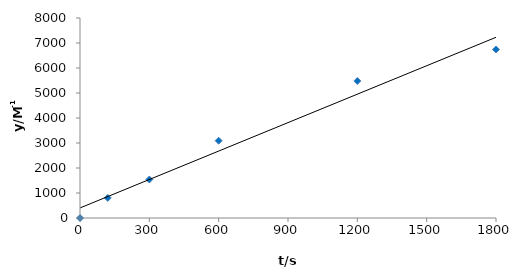
| Category | Series 0 |
|---|---|
| 0.0 | 0 |
| 120.0 | 803.289 |
| 300.0 | 1540.625 |
| 600.0 | 3092.563 |
| 1200.0 | 5480.721 |
| 1800.0 | 6741.555 |